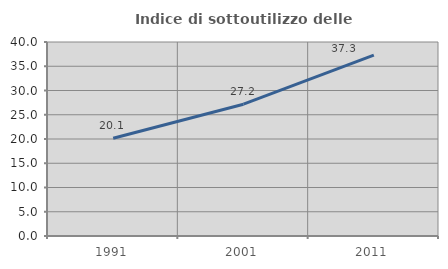
| Category | Indice di sottoutilizzo delle abitazioni  |
|---|---|
| 1991.0 | 20.145 |
| 2001.0 | 27.175 |
| 2011.0 | 37.305 |